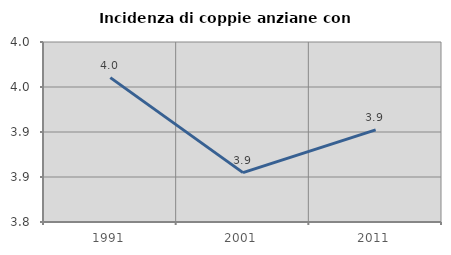
| Category | Incidenza di coppie anziane con figli |
|---|---|
| 1991.0 | 3.96 |
| 2001.0 | 3.855 |
| 2011.0 | 3.902 |